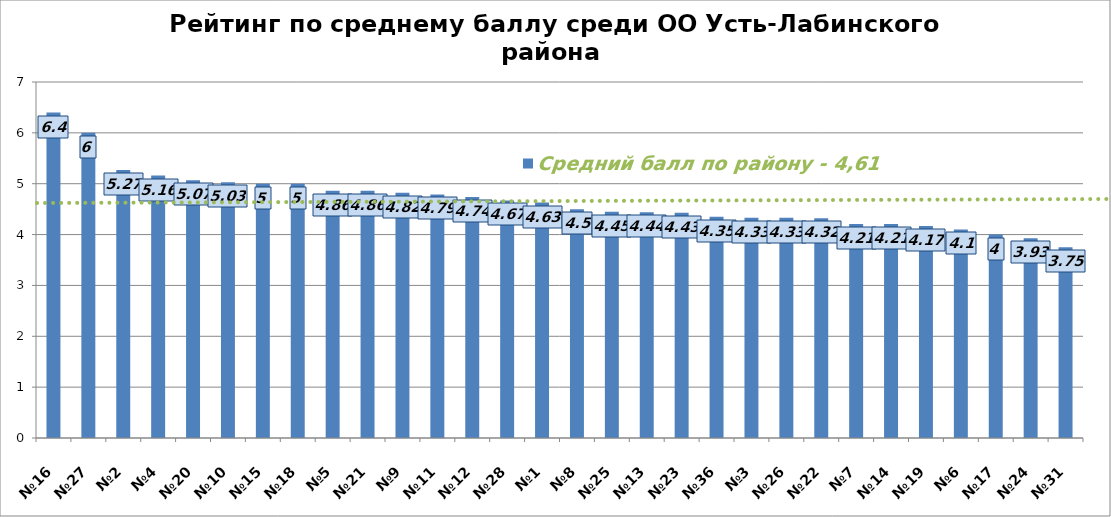
| Category | Средний балл по району - 4,61 |
|---|---|
| №16 | 6.4 |
| №27 | 6 |
| №2 | 5.27 |
| №4 | 5.16 |
| №20 | 5.07 |
| №10 | 5.03 |
| №15 | 5 |
| №18 | 5 |
| №5 | 4.86 |
| №21 | 4.86 |
| №9 | 4.82 |
| №11 | 4.79 |
| №12 | 4.74 |
| №28 | 4.67 |
| №1 | 4.63 |
| №8 | 4.5 |
| №25 | 4.45 |
| №13 | 4.44 |
| №23 | 4.43 |
| №36 | 4.35 |
| №3 | 4.33 |
| №26 | 4.33 |
| №22 | 4.32 |
| №7 | 4.21 |
| №14 | 4.21 |
| №19 | 4.17 |
| №6 | 4.1 |
| №17 | 4 |
| №24 | 3.93 |
| №31 | 3.75 |